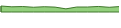
| Category | Series 0 |
|---|---|
| 0 | 199 |
| 1 | 173 |
| 2 | 182 |
| 3 | 158 |
| 4 | 176 |
| 5 | 163 |
| 6 | 105 |
| 7 | 166 |
| 8 | 166 |
| 9 | 184 |
| 10 | 157 |
| 11 | 182 |